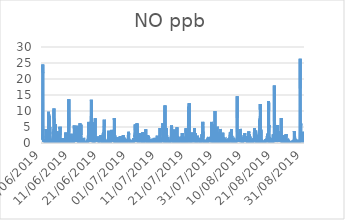
| Category | NO |
|---|---|
| 01/06/2019 | 2.2 |
| 01/06/2019 | 1.1 |
| 01/06/2019 | 1 |
| 01/06/2019 | 1.1 |
| 01/06/2019 | 2.9 |
| 01/06/2019 | 14.8 |
| 01/06/2019 | 24.5 |
| 01/06/2019 | 21.8 |
| 01/06/2019 | 12.9 |
| 01/06/2019 | 4.1 |
| 01/06/2019 | 1.1 |
| 01/06/2019 | 0.4 |
| 01/06/2019 | 0.6 |
| 01/06/2019 | 0.8 |
| 01/06/2019 | 0.4 |
| 01/06/2019 | 0.5 |
| 01/06/2019 | 0.3 |
| 01/06/2019 | 0.3 |
| 01/06/2019 | 0.6 |
| 01/06/2019 | 1 |
| 01/06/2019 | 1.1 |
| 01/06/2019 | 0.6 |
| 01/06/2019 | 0.5 |
| 01/06/2019 | 0.3 |
| 02/06/2019 | 0.2 |
| 02/06/2019 | 0.2 |
| 02/06/2019 | 0.1 |
| 02/06/2019 | 0.1 |
| 02/06/2019 | 0.1 |
| 02/06/2019 | 0.6 |
| 02/06/2019 | 1.3 |
| 02/06/2019 | 1.7 |
| 02/06/2019 | 2.1 |
| 02/06/2019 | 2.4 |
| 02/06/2019 | 4.4 |
| 02/06/2019 | 1.8 |
| 02/06/2019 | 1.4 |
| 02/06/2019 | 1.3 |
| 02/06/2019 | 0.8 |
| 02/06/2019 | 0.9 |
| 02/06/2019 | 0.6 |
| 02/06/2019 | 0.5 |
| 02/06/2019 | 0.6 |
| 02/06/2019 | 0.5 |
| 02/06/2019 | 0.6 |
| 02/06/2019 | 0.6 |
| 02/06/2019 | 0.2 |
| 02/06/2019 | 0.1 |
| 03/06/2019 | 0.3 |
| 03/06/2019 | 0.1 |
| 03/06/2019 | 0.1 |
| 03/06/2019 | 0.1 |
| 03/06/2019 | 0.2 |
| 03/06/2019 | 1.6 |
| 03/06/2019 | 3.2 |
| 03/06/2019 | 9.8 |
| 03/06/2019 | 4.8 |
| 03/06/2019 | 2.4 |
| 03/06/2019 | 2.1 |
| 03/06/2019 | 1.2 |
| 03/06/2019 | 1.9 |
| 03/06/2019 | 8.5 |
| 03/06/2019 | 1.4 |
| 03/06/2019 | 2.4 |
| 03/06/2019 | 1.5 |
| 03/06/2019 | 5 |
| 03/06/2019 | 2.7 |
| 03/06/2019 | 0.4 |
| 03/06/2019 | 0.6 |
| 03/06/2019 | 0.2 |
| 03/06/2019 | 0.2 |
| 03/06/2019 | 0.3 |
| 04/06/2019 | 0.2 |
| 04/06/2019 | 0.1 |
| 04/06/2019 | 0.1 |
| 04/06/2019 | 0.1 |
| 04/06/2019 | 0.2 |
| 04/06/2019 | 0.5 |
| 04/06/2019 | 1.3 |
| 04/06/2019 | 1.5 |
| 04/06/2019 | 1 |
| 04/06/2019 | 0.7 |
| 04/06/2019 | 1.3 |
| 04/06/2019 | 0.3 |
| 04/06/2019 | 0.4 |
| 04/06/2019 | 0.3 |
| 04/06/2019 | 0.3 |
| 04/06/2019 | 0.3 |
| 04/06/2019 | 0.2 |
| 04/06/2019 | 1.1 |
| 04/06/2019 | 0.5 |
| 04/06/2019 | 0.3 |
| 04/06/2019 | 0.1 |
| 04/06/2019 | 0.1 |
| 04/06/2019 | 0.6 |
| 04/06/2019 | 2.2 |
| 05/06/2019 | 3.8 |
| 05/06/2019 | 3.4 |
| 05/06/2019 | 4.4 |
| 05/06/2019 | 10.2 |
| 05/06/2019 | 10.8 |
| 05/06/2019 | 10.7 |
| 05/06/2019 | 6.1 |
| 05/06/2019 | 2.6 |
| 05/06/2019 | 1.8 |
| 05/06/2019 | 2 |
| 05/06/2019 | 1 |
| 05/06/2019 | 4.2 |
| 05/06/2019 | 2 |
| 05/06/2019 | 0.6 |
| 05/06/2019 | 1.7 |
| 05/06/2019 | 5.9 |
| 05/06/2019 | 0.2 |
| 05/06/2019 | 0.2 |
| 05/06/2019 | 0.2 |
| 05/06/2019 | 0.2 |
| 05/06/2019 | 0.3 |
| 05/06/2019 | 0.3 |
| 05/06/2019 | 0.1 |
| 05/06/2019 | 0.1 |
| 06/06/2019 | 0.1 |
| 06/06/2019 | 0.1 |
| 06/06/2019 | 0.1 |
| 06/06/2019 | 0.1 |
| 06/06/2019 | 0.2 |
| 06/06/2019 | 1.2 |
| 06/06/2019 | 3.7 |
| 06/06/2019 | 3.2 |
| 06/06/2019 | 2 |
| 06/06/2019 | 2.7 |
| 06/06/2019 | 1.8 |
| 06/06/2019 | 1.1 |
| 06/06/2019 | 3 |
| 06/06/2019 | 3.3 |
| 06/06/2019 | 1.8 |
| 06/06/2019 | 1.3 |
| 06/06/2019 | 0.8 |
| 06/06/2019 | 0.9 |
| 06/06/2019 | 0.5 |
| 06/06/2019 | 0.6 |
| 06/06/2019 | 0.4 |
| 06/06/2019 | 0.3 |
| 06/06/2019 | 0.1 |
| 06/06/2019 | 0.3 |
| 07/06/2019 | 0.1 |
| 07/06/2019 | 0.1 |
| 07/06/2019 | 0.1 |
| 07/06/2019 | 0.1 |
| 07/06/2019 | 0.3 |
| 07/06/2019 | 1.5 |
| 07/06/2019 | 5.1 |
| 07/06/2019 | 4.4 |
| 07/06/2019 | 5 |
| 07/06/2019 | 2.4 |
| 07/06/2019 | 1 |
| 07/06/2019 | 0.6 |
| 07/06/2019 | 0.4 |
| 07/06/2019 | 0.4 |
| 07/06/2019 | 0.3 |
| 07/06/2019 | 0.2 |
| 07/06/2019 | 0.4 |
| 07/06/2019 | 0.3 |
| 07/06/2019 | 0.2 |
| 07/06/2019 | 0.2 |
| 07/06/2019 | 0.2 |
| 07/06/2019 | 0.2 |
| 07/06/2019 | 0.1 |
| 07/06/2019 | 0.1 |
| 08/06/2019 | 0.1 |
| 08/06/2019 | 0.1 |
| 08/06/2019 | 0.1 |
| 08/06/2019 | 0.2 |
| 08/06/2019 | 0.2 |
| 08/06/2019 | 0.2 |
| 08/06/2019 | 0.4 |
| 08/06/2019 | 0.6 |
| 08/06/2019 | 0.6 |
| 08/06/2019 | 1.5 |
| 08/06/2019 | 1.2 |
| 08/06/2019 | 0.8 |
| 08/06/2019 | 1 |
| 08/06/2019 | 0.8 |
| 08/06/2019 | 0.7 |
| 08/06/2019 | 0.6 |
| 08/06/2019 | 0.5 |
| 08/06/2019 | 0.4 |
| 08/06/2019 | 0.4 |
| 08/06/2019 | 0.2 |
| 08/06/2019 | 0.2 |
| 08/06/2019 | 0.2 |
| 08/06/2019 | 0.2 |
| 08/06/2019 | 0.2 |
| 09/06/2019 | 0.2 |
| 09/06/2019 | 0.2 |
| 09/06/2019 | 0.2 |
| 09/06/2019 | 0.3 |
| 09/06/2019 | 0.8 |
| 09/06/2019 | 1.5 |
| 09/06/2019 | 3.3 |
| 09/06/2019 | 2.5 |
| 09/06/2019 | 1.4 |
| 09/06/2019 | 0.6 |
| 09/06/2019 | 1 |
| 09/06/2019 | 0.9 |
| 09/06/2019 | 0.5 |
| 09/06/2019 | 0.7 |
| 09/06/2019 | 0.3 |
| 09/06/2019 | 0.2 |
| 09/06/2019 | 0.2 |
| 09/06/2019 | 0.2 |
| 09/06/2019 | 0.2 |
| 09/06/2019 | 0.2 |
| 09/06/2019 | 0.1 |
| 09/06/2019 | 0.2 |
| 09/06/2019 | 0.2 |
| 09/06/2019 | 0.2 |
| 10/06/2019 | 0.3 |
| 10/06/2019 | 0.5 |
| 10/06/2019 | 0.6 |
| 10/06/2019 | 0.8 |
| 10/06/2019 | 1 |
| 10/06/2019 | 3.1 |
| 10/06/2019 | 9.6 |
| 10/06/2019 | 8 |
| 10/06/2019 | 5.4 |
| 10/06/2019 | 13.7 |
| 10/06/2019 | 3.3 |
| 10/06/2019 | 1 |
| 10/06/2019 | 0.5 |
| 10/06/2019 | 2.8 |
| 10/06/2019 | 0.5 |
| 10/06/2019 | 0.7 |
| 10/06/2019 | 0.5 |
| 10/06/2019 | 0.2 |
| 10/06/2019 | 0.2 |
| 10/06/2019 | 0.4 |
| 10/06/2019 | 0.3 |
| 10/06/2019 | 0.4 |
| 10/06/2019 | 0.2 |
| 10/06/2019 | 0.1 |
| 11/06/2019 | 0.2 |
| 11/06/2019 | 0.2 |
| 11/06/2019 | 0.1 |
| 11/06/2019 | 0.2 |
| 11/06/2019 | 0.3 |
| 11/06/2019 | 2.9 |
| 11/06/2019 | 1.5 |
| 11/06/2019 | 2.1 |
| 11/06/2019 | 0.8 |
| 11/06/2019 | 0.9 |
| 11/06/2019 | 0.5 |
| 11/06/2019 | 0.8 |
| 11/06/2019 | 0.4 |
| 11/06/2019 | 0.9 |
| 11/06/2019 | 0.5 |
| 11/06/2019 | 0.6 |
| 11/06/2019 | 0.5 |
| 11/06/2019 | 0.3 |
| 11/06/2019 | 0.2 |
| 11/06/2019 | 0.2 |
| 11/06/2019 | 0.2 |
| 11/06/2019 | 0.2 |
| 11/06/2019 | 0.2 |
| 11/06/2019 | 0.2 |
| 12/06/2019 | 0.3 |
| 12/06/2019 | 0.3 |
| 12/06/2019 | 0.5 |
| 12/06/2019 | 0.6 |
| 12/06/2019 | 1.1 |
| 12/06/2019 | 2.4 |
| 12/06/2019 | 4.3 |
| 12/06/2019 | 5.5 |
| 12/06/2019 | 2.6 |
| 12/06/2019 | 1.5 |
| 12/06/2019 | 0.6 |
| 12/06/2019 | 1.7 |
| 12/06/2019 | 0.3 |
| 12/06/2019 | 1.4 |
| 12/06/2019 | 0.5 |
| 12/06/2019 | 1.3 |
| 12/06/2019 | 0.3 |
| 12/06/2019 | 1.6 |
| 12/06/2019 | 0.7 |
| 12/06/2019 | 1.1 |
| 12/06/2019 | 1 |
| 12/06/2019 | 0.6 |
| 12/06/2019 | 1.1 |
| 12/06/2019 | 0.3 |
| 13/06/2019 | 0.3 |
| 13/06/2019 | 0.2 |
| 13/06/2019 | 0.1 |
| 13/06/2019 | 0.1 |
| 13/06/2019 | 0.4 |
| 13/06/2019 | 2.3 |
| 13/06/2019 | 5 |
| 13/06/2019 | 4.9 |
| 13/06/2019 | 5.4 |
| 13/06/2019 | 5.2 |
| 13/06/2019 | 2.3 |
| 13/06/2019 | 2.2 |
| 13/06/2019 | 2.3 |
| 13/06/2019 | 0.3 |
| 13/06/2019 | 0.3 |
| 13/06/2019 | 0.4 |
| 13/06/2019 | 0.3 |
| 13/06/2019 | 1.2 |
| 13/06/2019 | 0.4 |
| 13/06/2019 | 0.4 |
| 13/06/2019 | 0.3 |
| 13/06/2019 | 0.4 |
| 13/06/2019 | 0.4 |
| 13/06/2019 | 0.2 |
| 14/06/2019 | 0.1 |
| 14/06/2019 | 0.2 |
| 14/06/2019 | 0.1 |
| 14/06/2019 | 0.2 |
| 14/06/2019 | 1.1 |
| 14/06/2019 | 2.2 |
| 14/06/2019 | 6.2 |
| 14/06/2019 | 5.9 |
| 14/06/2019 | 2.5 |
| 14/06/2019 | 2.4 |
| 14/06/2019 | 1.5 |
| 14/06/2019 | 4.7 |
| 14/06/2019 | 2.5 |
| 14/06/2019 | 2.4 |
| 14/06/2019 | 5.7 |
| 14/06/2019 | 2.6 |
| 14/06/2019 | 2.4 |
| 14/06/2019 | 1.9 |
| 14/06/2019 | 1.3 |
| 14/06/2019 | 0.4 |
| 14/06/2019 | 0.2 |
| 14/06/2019 | 0.4 |
| 14/06/2019 | 0.2 |
| 14/06/2019 | 0.3 |
| 15/06/2019 | 0.1 |
| 15/06/2019 | 0.1 |
| 15/06/2019 | 0.2 |
| 15/06/2019 | 0.2 |
| 15/06/2019 | 0.2 |
| 15/06/2019 | 0.4 |
| 15/06/2019 | 0.5 |
| 15/06/2019 | 0.6 |
| 15/06/2019 | 0.9 |
| 15/06/2019 | 0.4 |
| 15/06/2019 | 0.4 |
| 15/06/2019 | 0.4 |
| 15/06/2019 | 0.7 |
| 15/06/2019 | 1.6 |
| 15/06/2019 | 1.3 |
| 15/06/2019 | 0.7 |
| 15/06/2019 | 0.9 |
| 15/06/2019 | 0.8 |
| 15/06/2019 | 0.4 |
| 15/06/2019 | 0.3 |
| 15/06/2019 | 0.3 |
| 15/06/2019 | 0.5 |
| 15/06/2019 | 0.1 |
| 15/06/2019 | 0.4 |
| 16/06/2019 | 0.1 |
| 16/06/2019 | 0.2 |
| 16/06/2019 | 0.1 |
| 16/06/2019 | 0.1 |
| 16/06/2019 | 0.3 |
| 16/06/2019 | 0.4 |
| 16/06/2019 | 0.5 |
| 16/06/2019 | 0.6 |
| 16/06/2019 | 0.5 |
| 16/06/2019 | 0.3 |
| 16/06/2019 | 0.3 |
| 16/06/2019 | 0.3 |
| 16/06/2019 | 0.4 |
| 16/06/2019 | 0.3 |
| 16/06/2019 | 0.4 |
| 16/06/2019 | 0.5 |
| 16/06/2019 | 0.6 |
| 16/06/2019 | 0.5 |
| 16/06/2019 | 0.3 |
| 16/06/2019 | 0.4 |
| 16/06/2019 | 0.4 |
| 16/06/2019 | 0.8 |
| 16/06/2019 | 0.2 |
| 16/06/2019 | 0.1 |
| 17/06/2019 | 0.1 |
| 17/06/2019 | 0.2 |
| 17/06/2019 | 0.6 |
| 17/06/2019 | 1.1 |
| 17/06/2019 | 1.2 |
| 17/06/2019 | 2.4 |
| 17/06/2019 | 5.6 |
| 17/06/2019 | 6.6 |
| 17/06/2019 | 2.6 |
| 17/06/2019 | 1 |
| 17/06/2019 | 0.6 |
| 17/06/2019 | 2.6 |
| 17/06/2019 | 0.9 |
| 17/06/2019 | 0.4 |
| 17/06/2019 | 0.7 |
| 17/06/2019 | 0.8 |
| 17/06/2019 | 2.4 |
| 17/06/2019 | 1.3 |
| 17/06/2019 | 1.3 |
| 17/06/2019 | 1.1 |
| 17/06/2019 | 0.6 |
| 17/06/2019 | 0.9 |
| 17/06/2019 | 1.1 |
| 17/06/2019 | 0.3 |
| 18/06/2019 | 0.4 |
| 18/06/2019 | 0.7 |
| 18/06/2019 | 0.4 |
| 18/06/2019 | 3 |
| 18/06/2019 | 2.1 |
| 18/06/2019 | 8.4 |
| 18/06/2019 | 13.5 |
| 18/06/2019 | 5.6 |
| 18/06/2019 | 2.5 |
| 18/06/2019 | 3.6 |
| 18/06/2019 | 2.8 |
| 18/06/2019 | 2 |
| 18/06/2019 | 1 |
| 18/06/2019 | 1.8 |
| 18/06/2019 | 2.8 |
| 18/06/2019 | 1.5 |
| 18/06/2019 | 2.6 |
| 18/06/2019 | 1.5 |
| 18/06/2019 | 1.7 |
| 18/06/2019 | 0.8 |
| 18/06/2019 | 0.4 |
| 18/06/2019 | 0.8 |
| 18/06/2019 | 0.4 |
| 18/06/2019 | 0.6 |
| 19/06/2019 | 0.1 |
| 19/06/2019 | 0.1 |
| 19/06/2019 | 1.3 |
| 19/06/2019 | 0.1 |
| 19/06/2019 | 0.4 |
| 19/06/2019 | 1.4 |
| 19/06/2019 | 4.9 |
| 19/06/2019 | 6.5 |
| 19/06/2019 | 3.5 |
| 19/06/2019 | 1.4 |
| 19/06/2019 | 1.5 |
| 19/06/2019 | 1.4 |
| 19/06/2019 | 1 |
| 19/06/2019 | 2.1 |
| 19/06/2019 | 7.7 |
| 19/06/2019 | 2.3 |
| 19/06/2019 | 1.4 |
| 19/06/2019 | 1 |
| 19/06/2019 | 0.8 |
| 19/06/2019 | 0.9 |
| 19/06/2019 | 0.8 |
| 19/06/2019 | 0.4 |
| 19/06/2019 | 0.2 |
| 19/06/2019 | 0.3 |
| 20/06/2019 | 0.3 |
| 20/06/2019 | 0.1 |
| 20/06/2019 | 0.1 |
| 20/06/2019 | 0.1 |
| 20/06/2019 | 0.3 |
| 20/06/2019 | 0.7 |
| 20/06/2019 | 2 |
| 20/06/2019 | 0.9 |
| 20/06/2019 | 0.4 |
| 20/06/2019 | 0.4 |
| 20/06/2019 | 0.4 |
| 20/06/2019 | 0.6 |
| 20/06/2019 | 0.4 |
| 20/06/2019 | 0.4 |
| 20/06/2019 | 0.7 |
| 20/06/2019 | 1.2 |
| 20/06/2019 | 0.4 |
| 20/06/2019 | 0.5 |
| 20/06/2019 | 1.1 |
| 20/06/2019 | 0.4 |
| 20/06/2019 | 0.3 |
| 20/06/2019 | 0.8 |
| 20/06/2019 | 0.3 |
| 20/06/2019 | 0.2 |
| 21/06/2019 | 0.1 |
| 21/06/2019 | 0.1 |
| 21/06/2019 | 0.1 |
| 21/06/2019 | 0.1 |
| 21/06/2019 | 0.2 |
| 21/06/2019 | 0.4 |
| 21/06/2019 | 0.9 |
| 21/06/2019 | 2.2 |
| 21/06/2019 | 2.4 |
| 21/06/2019 | 1.5 |
| 21/06/2019 | 1.7 |
| 21/06/2019 | 2 |
| 21/06/2019 | 2.4 |
| 21/06/2019 | 2.7 |
| 21/06/2019 | 2.5 |
| 21/06/2019 | 1.9 |
| 21/06/2019 | 2.5 |
| 21/06/2019 | 1.4 |
| 21/06/2019 | 0.7 |
| 21/06/2019 | 0.5 |
| 21/06/2019 | 0.9 |
| 21/06/2019 | 0.4 |
| 21/06/2019 | 0.2 |
| 21/06/2019 | 0.3 |
| 22/06/2019 | 0.2 |
| 22/06/2019 | 0.2 |
| 22/06/2019 | 0.1 |
| 22/06/2019 | 0.1 |
| 22/06/2019 | 0.1 |
| 22/06/2019 | 0.2 |
| 22/06/2019 | 0.3 |
| 22/06/2019 | 0.7 |
| 22/06/2019 | 0.4 |
| 22/06/2019 | 0.7 |
| 22/06/2019 | 3 |
| 22/06/2019 | 1.4 |
| 22/06/2019 | 1.2 |
| 22/06/2019 | 1.8 |
| 22/06/2019 | 3.4 |
| 22/06/2019 | 0.9 |
| 22/06/2019 | 4.1 |
| 22/06/2019 | 5.1 |
| 22/06/2019 | 7.3 |
| 22/06/2019 | 4.9 |
| 22/06/2019 | 0.1 |
| 22/06/2019 | 0.2 |
| 22/06/2019 | 0.1 |
| 22/06/2019 | 0.1 |
| 23/06/2019 | 0.1 |
| 23/06/2019 | 0.1 |
| 23/06/2019 | 0.1 |
| 23/06/2019 | 0.1 |
| 23/06/2019 | 0.4 |
| 23/06/2019 | 0.3 |
| 23/06/2019 | 0.5 |
| 23/06/2019 | 0.5 |
| 23/06/2019 | 0.4 |
| 23/06/2019 | 0.3 |
| 23/06/2019 | 0.5 |
| 23/06/2019 | 0.5 |
| 23/06/2019 | 0.3 |
| 23/06/2019 | 0.3 |
| 23/06/2019 | 0.5 |
| 23/06/2019 | 0.5 |
| 23/06/2019 | 0.4 |
| 23/06/2019 | 0.4 |
| 23/06/2019 | 0.7 |
| 23/06/2019 | 0.3 |
| 23/06/2019 | 0.3 |
| 23/06/2019 | 0.4 |
| 23/06/2019 | 0.1 |
| 23/06/2019 | 1 |
| 24/06/2019 | 0.3 |
| 24/06/2019 | 0.1 |
| 24/06/2019 | 0.1 |
| 24/06/2019 | 0.3 |
| 24/06/2019 | 0.3 |
| 24/06/2019 | 1.3 |
| 24/06/2019 | 3.8 |
| 24/06/2019 | 2.4 |
| 24/06/2019 | 0.8 |
| 24/06/2019 | 1.7 |
| 24/06/2019 | 1.4 |
| 24/06/2019 | 1.2 |
| 24/06/2019 | 1 |
| 24/06/2019 | 0.4 |
| 24/06/2019 | 0.5 |
| 24/06/2019 | 0.3 |
| 24/06/2019 | 0.2 |
| 24/06/2019 | 0.4 |
| 24/06/2019 | 0.6 |
| 24/06/2019 | 0.3 |
| 24/06/2019 | 0.4 |
| 24/06/2019 | 0.2 |
| 24/06/2019 | 0.2 |
| 24/06/2019 | 0.2 |
| 25/06/2019 | 0.2 |
| 25/06/2019 | 0.3 |
| 25/06/2019 | 0.3 |
| 25/06/2019 | 0.5 |
| 25/06/2019 | 0.3 |
| 25/06/2019 | 0.8 |
| 25/06/2019 | 4.1 |
| 25/06/2019 | 0.9 |
| 25/06/2019 | 0.9 |
| 25/06/2019 | 0.8 |
| 25/06/2019 | 0.8 |
| 25/06/2019 | 1 |
| 25/06/2019 | 0.5 |
| 25/06/2019 | 0.8 |
| 25/06/2019 | 1.5 |
| 25/06/2019 | 0.8 |
| 25/06/2019 | 0.4 |
| 25/06/2019 | 0.5 |
| 25/06/2019 | 0.4 |
| 25/06/2019 | 0.3 |
| 25/06/2019 | 0.1 |
| 25/06/2019 | 1.1 |
| 25/06/2019 | 2.8 |
| 25/06/2019 | 0.8 |
| 26/06/2019 | 0.9 |
| 26/06/2019 | 0.4 |
| 26/06/2019 | 0.3 |
| 26/06/2019 | 0.9 |
| 26/06/2019 | 1.2 |
| 26/06/2019 | 2.5 |
| 26/06/2019 | 7.8 |
| 26/06/2019 | 7.8 |
| 26/06/2019 | 6.9 |
| 26/06/2019 | 2.5 |
| 26/06/2019 | 0.5 |
| 26/06/2019 | 0.6 |
| 26/06/2019 | 0.5 |
| 26/06/2019 | 0.2 |
| 26/06/2019 | 0.6 |
| 26/06/2019 | 0.6 |
| 26/06/2019 | 0.9 |
| 26/06/2019 | 0.2 |
| 26/06/2019 | 0.3 |
| 26/06/2019 | 0.2 |
| 26/06/2019 | 0.5 |
| 26/06/2019 | 0.4 |
| 26/06/2019 | 0.3 |
| 26/06/2019 | 0.2 |
| 27/06/2019 | 0.2 |
| 27/06/2019 | 0.1 |
| 27/06/2019 | 0.1 |
| 27/06/2019 | 0.1 |
| 27/06/2019 | 0.1 |
| 27/06/2019 | 0.3 |
| 27/06/2019 | 0.9 |
| 27/06/2019 | 1 |
| 27/06/2019 | 1.2 |
| 27/06/2019 | 1.1 |
| 27/06/2019 | 1.3 |
| 27/06/2019 | 0.9 |
| 27/06/2019 | 1.8 |
| 27/06/2019 | 0.9 |
| 27/06/2019 | 1.6 |
| 27/06/2019 | 1.5 |
| 27/06/2019 | 1.3 |
| 27/06/2019 | 1.5 |
| 27/06/2019 | 0.8 |
| 27/06/2019 | 1.1 |
| 27/06/2019 | 0.4 |
| 27/06/2019 | 0.4 |
| 27/06/2019 | 0.1 |
| 27/06/2019 | 0.1 |
| 28/06/2019 | 0.1 |
| 28/06/2019 | 0.1 |
| 28/06/2019 | 0.1 |
| 28/06/2019 | 0.1 |
| 28/06/2019 | 0.2 |
| 28/06/2019 | 0.4 |
| 28/06/2019 | 0.7 |
| 28/06/2019 | 1 |
| 28/06/2019 | 1.5 |
| 28/06/2019 | 2.2 |
| 28/06/2019 | 0.7 |
| 28/06/2019 | 0.8 |
| 28/06/2019 | 0.8 |
| 28/06/2019 | 1 |
| 28/06/2019 | 0.9 |
| 28/06/2019 | 1.7 |
| 28/06/2019 | 1 |
| 28/06/2019 | 0.6 |
| 28/06/2019 | 0.8 |
| 28/06/2019 | 0.6 |
| 28/06/2019 | 0.4 |
| 28/06/2019 | 0.3 |
| 28/06/2019 | 0.1 |
| 28/06/2019 | 0.1 |
| 29/06/2019 | 0.2 |
| 29/06/2019 | 0.2 |
| 29/06/2019 | 0.1 |
| 29/06/2019 | 0.1 |
| 29/06/2019 | 0.1 |
| 29/06/2019 | 0.1 |
| 29/06/2019 | 1.4 |
| 29/06/2019 | 1.3 |
| 29/06/2019 | 1 |
| 29/06/2019 | 2.4 |
| 29/06/2019 | 2 |
| 29/06/2019 | 1.6 |
| 29/06/2019 | 1.2 |
| 29/06/2019 | 0.7 |
| 29/06/2019 | 1.7 |
| 29/06/2019 | 1 |
| 29/06/2019 | 0.3 |
| 29/06/2019 | 0.3 |
| 29/06/2019 | 0.3 |
| 29/06/2019 | 0.2 |
| 29/06/2019 | 0.2 |
| 29/06/2019 | 0.1 |
| 29/06/2019 | 0.2 |
| 29/06/2019 | 0.5 |
| 30/06/2019 | 0.6 |
| 30/06/2019 | 0.3 |
| 30/06/2019 | 0.3 |
| 30/06/2019 | 0.5 |
| 30/06/2019 | 0.4 |
| 30/06/2019 | 0.7 |
| 30/06/2019 | 0.8 |
| 30/06/2019 | 1 |
| 30/06/2019 | 0.8 |
| 30/06/2019 | 0.4 |
| 30/06/2019 | 0.5 |
| 30/06/2019 | 0.3 |
| 30/06/2019 | 0.3 |
| 30/06/2019 | 0.4 |
| 30/06/2019 | 0.3 |
| 30/06/2019 | 0.2 |
| 30/06/2019 | 0.4 |
| 30/06/2019 | 0.7 |
| 30/06/2019 | 0.4 |
| 30/06/2019 | 0.7 |
| 30/06/2019 | 0.3 |
| 30/06/2019 | 0.3 |
| 30/06/2019 | 0.3 |
| 30/06/2019 | 0.3 |
| 01/07/2019 | 0.4 |
| 01/07/2019 | 0.3 |
| 01/07/2019 | 0.7 |
| 01/07/2019 | 0.5 |
| 01/07/2019 | 0.4 |
| 01/07/2019 | 2.7 |
| 01/07/2019 | 3.5 |
| 01/07/2019 | 3.5 |
| 01/07/2019 | 2.5 |
| 01/07/2019 | 1.3 |
| 01/07/2019 | 0.7 |
| 01/07/2019 | 0.5 |
| 01/07/2019 | 0.5 |
| 01/07/2019 | 0.6 |
| 01/07/2019 | 0.6 |
| 01/07/2019 | 0.4 |
| 01/07/2019 | 0.4 |
| 01/07/2019 | 0.2 |
| 01/07/2019 | 0.2 |
| 01/07/2019 | 0.3 |
| 01/07/2019 | 0.3 |
| 01/07/2019 | 0.1 |
| 01/07/2019 | 0.5 |
| 01/07/2019 | 0.1 |
| 02/07/2019 | 0.1 |
| 02/07/2019 | 0.1 |
| 02/07/2019 | 0.1 |
| 02/07/2019 | 0.1 |
| 02/07/2019 | 0.2 |
| 02/07/2019 | 0.3 |
| 02/07/2019 | 0.6 |
| 02/07/2019 | 0.7 |
| 02/07/2019 | 0.5 |
| 02/07/2019 | 0.4 |
| 02/07/2019 | 0.5 |
| 02/07/2019 | 0.6 |
| 02/07/2019 | 0.3 |
| 02/07/2019 | 0.7 |
| 02/07/2019 | 0.7 |
| 02/07/2019 | 0.5 |
| 02/07/2019 | 0.4 |
| 02/07/2019 | 0.3 |
| 02/07/2019 | 0.3 |
| 02/07/2019 | 0.3 |
| 02/07/2019 | 0.1 |
| 02/07/2019 | 0.7 |
| 02/07/2019 | 0.2 |
| 02/07/2019 | 0.1 |
| 03/07/2019 | 0.1 |
| 03/07/2019 | 0.1 |
| 03/07/2019 | 0.2 |
| 03/07/2019 | 0.2 |
| 03/07/2019 | 1.5 |
| 03/07/2019 | 1.1 |
| 03/07/2019 | 1.5 |
| 03/07/2019 | 1.3 |
| 03/07/2019 | 1.7 |
| 03/07/2019 | 1.3 |
| 03/07/2019 | 0.8 |
| 03/07/2019 | 1.4 |
| 03/07/2019 | 2.6 |
| 03/07/2019 | 1.8 |
| 03/07/2019 | 5.8 |
| 03/07/2019 | 4 |
| 03/07/2019 | 1.7 |
| 03/07/2019 | 1.3 |
| 03/07/2019 | 3.1 |
| 03/07/2019 | 0.8 |
| 03/07/2019 | 0.6 |
| 03/07/2019 | 0.3 |
| 03/07/2019 | 0.1 |
| 03/07/2019 | 0.2 |
| 04/07/2019 | 0.3 |
| 04/07/2019 | 0.2 |
| 04/07/2019 | 0.2 |
| 04/07/2019 | 0.2 |
| 04/07/2019 | 0.2 |
| 04/07/2019 | 1.8 |
| 04/07/2019 | 6.2 |
| 04/07/2019 | 4.3 |
| 04/07/2019 | 2.8 |
| 04/07/2019 | 4.2 |
| 04/07/2019 | 1.6 |
| 04/07/2019 | 0.4 |
| 04/07/2019 | 0.7 |
| 04/07/2019 | 2.1 |
| 04/07/2019 | 0.7 |
| 04/07/2019 | 1.1 |
| 04/07/2019 | 1.1 |
| 04/07/2019 | 1.2 |
| 04/07/2019 | 1 |
| 04/07/2019 | 0.2 |
| 04/07/2019 | 0.4 |
| 04/07/2019 | 0.6 |
| 04/07/2019 | 0.4 |
| 04/07/2019 | 0.4 |
| 05/07/2019 | 0.4 |
| 05/07/2019 | 1 |
| 05/07/2019 | 0.3 |
| 05/07/2019 | 0.6 |
| 05/07/2019 | 2.7 |
| 05/07/2019 | 2.4 |
| 05/07/2019 | 1.4 |
| 05/07/2019 | 3.1 |
| 05/07/2019 | 1.7 |
| 05/07/2019 | 1 |
| 05/07/2019 | 1.1 |
| 05/07/2019 | 0.7 |
| 05/07/2019 | 1.1 |
| 05/07/2019 | 1.2 |
| 05/07/2019 | 1.2 |
| 05/07/2019 | 0.7 |
| 05/07/2019 | 0.6 |
| 05/07/2019 | 0.8 |
| 05/07/2019 | 0.7 |
| 05/07/2019 | 0.6 |
| 05/07/2019 | 0.3 |
| 05/07/2019 | 0.3 |
| 05/07/2019 | 0.3 |
| 05/07/2019 | 0.3 |
| 06/07/2019 | 0.3 |
| 06/07/2019 | 0.1 |
| 06/07/2019 | 0.2 |
| 06/07/2019 | 0.2 |
| 06/07/2019 | 0.2 |
| 06/07/2019 | 0.8 |
| 06/07/2019 | 3.4 |
| 06/07/2019 | 2.6 |
| 06/07/2019 | 2.4 |
| 06/07/2019 | 0.7 |
| 06/07/2019 | 1 |
| 06/07/2019 | 0.6 |
| 06/07/2019 | 0.9 |
| 06/07/2019 | 0.8 |
| 06/07/2019 | 0.7 |
| 06/07/2019 | 0.9 |
| 06/07/2019 | 0.6 |
| 06/07/2019 | 0.4 |
| 06/07/2019 | 0.4 |
| 06/07/2019 | 0.2 |
| 06/07/2019 | 0.4 |
| 06/07/2019 | 0.4 |
| 06/07/2019 | 0.3 |
| 06/07/2019 | 1.2 |
| 07/07/2019 | 3.2 |
| 07/07/2019 | 0.3 |
| 07/07/2019 | 0.5 |
| 07/07/2019 | 0.1 |
| 07/07/2019 | 0.7 |
| 07/07/2019 | 1.1 |
| 07/07/2019 | 1.4 |
| 07/07/2019 | 4.3 |
| 07/07/2019 | 0.9 |
| 07/07/2019 | 0.9 |
| 07/07/2019 | 0.6 |
| 07/07/2019 | 0.8 |
| 07/07/2019 | 0.5 |
| 07/07/2019 | 0.6 |
| 07/07/2019 | 0.7 |
| 07/07/2019 | 0.5 |
| 07/07/2019 | 0.3 |
| 07/07/2019 | 0.4 |
| 07/07/2019 | 0.3 |
| 07/07/2019 | 0.4 |
| 07/07/2019 | 0.8 |
| 07/07/2019 | 0.3 |
| 07/07/2019 | 0.3 |
| 07/07/2019 | 0.2 |
| 08/07/2019 | 2.5 |
| 08/07/2019 | 0.1 |
| 08/07/2019 | 0.1 |
| 08/07/2019 | 0.1 |
| 08/07/2019 | 0.1 |
| 08/07/2019 | 0.7 |
| 08/07/2019 | 2.1 |
| 08/07/2019 | 2.2 |
| 08/07/2019 | 1.4 |
| 08/07/2019 | 1.7 |
| 08/07/2019 | 1.1 |
| 08/07/2019 | 1.3 |
| 08/07/2019 | 0.4 |
| 08/07/2019 | 0.7 |
| 08/07/2019 | 0.5 |
| 08/07/2019 | 0.9 |
| 08/07/2019 | 0.2 |
| 08/07/2019 | 0.6 |
| 08/07/2019 | 0.2 |
| 08/07/2019 | 0.5 |
| 08/07/2019 | 0.2 |
| 08/07/2019 | 0.1 |
| 08/07/2019 | 0.1 |
| 08/07/2019 | 0.1 |
| 09/07/2019 | 0.3 |
| 09/07/2019 | 0.1 |
| 09/07/2019 | 0.1 |
| 09/07/2019 | 0.1 |
| 09/07/2019 | 0.3 |
| 09/07/2019 | 0.3 |
| 09/07/2019 | 0.7 |
| 09/07/2019 | 1.3 |
| 09/07/2019 | 1.1 |
| 09/07/2019 | 1.3 |
| 09/07/2019 | 0.2 |
| 09/07/2019 | 0.5 |
| 09/07/2019 | 0.5 |
| 09/07/2019 | 0.4 |
| 09/07/2019 | 0.4 |
| 09/07/2019 | 0.2 |
| 09/07/2019 | 0.2 |
| 09/07/2019 | 0.9 |
| 09/07/2019 | 0.2 |
| 09/07/2019 | 0.2 |
| 09/07/2019 | 0.2 |
| 09/07/2019 | 0.7 |
| 09/07/2019 | 0.2 |
| 09/07/2019 | 0.1 |
| 10/07/2019 | 0.2 |
| 10/07/2019 | 0.2 |
| 10/07/2019 | 0.3 |
| 10/07/2019 | 0.2 |
| 10/07/2019 | 0.4 |
| 10/07/2019 | 0.7 |
| 10/07/2019 | 1.6 |
| 10/07/2019 | 1.5 |
| 10/07/2019 | 0.9 |
| 10/07/2019 | 0.9 |
| 10/07/2019 | 0 |
| 10/07/2019 | 0 |
| 10/07/2019 | 0 |
| 10/07/2019 | 0 |
| 10/07/2019 | 0 |
| 10/07/2019 | 0 |
| 10/07/2019 | 0 |
| 10/07/2019 | 1.5 |
| 10/07/2019 | 1.7 |
| 10/07/2019 | 1.1 |
| 10/07/2019 | 1.4 |
| 10/07/2019 | 1.2 |
| 10/07/2019 | 0.3 |
| 10/07/2019 | 0.6 |
| 11/07/2019 | 0.3 |
| 11/07/2019 | 0.4 |
| 11/07/2019 | 0.1 |
| 11/07/2019 | 0.2 |
| 11/07/2019 | 0.6 |
| 11/07/2019 | 0.8 |
| 11/07/2019 | 1 |
| 11/07/2019 | 2.3 |
| 11/07/2019 | 0 |
| 11/07/2019 | 0 |
| 11/07/2019 | 0 |
| 11/07/2019 | 0 |
| 11/07/2019 | 0 |
| 11/07/2019 | 0.9 |
| 11/07/2019 | 1.1 |
| 11/07/2019 | 0.7 |
| 11/07/2019 | 0.6 |
| 11/07/2019 | 0.3 |
| 11/07/2019 | 0.3 |
| 11/07/2019 | 0.2 |
| 11/07/2019 | 0.1 |
| 11/07/2019 | 0.2 |
| 11/07/2019 | 0.2 |
| 11/07/2019 | 0.2 |
| 12/07/2019 | 0.3 |
| 12/07/2019 | 0.3 |
| 12/07/2019 | 0.3 |
| 12/07/2019 | 0.5 |
| 12/07/2019 | 0.5 |
| 12/07/2019 | 1.1 |
| 12/07/2019 | 4.7 |
| 12/07/2019 | 2.1 |
| 12/07/2019 | 1.9 |
| 12/07/2019 | 1.4 |
| 12/07/2019 | 0.9 |
| 12/07/2019 | 0.7 |
| 12/07/2019 | 0.7 |
| 12/07/2019 | 1 |
| 12/07/2019 | 0.6 |
| 12/07/2019 | 0.4 |
| 12/07/2019 | 0.5 |
| 12/07/2019 | 0.3 |
| 12/07/2019 | 0.8 |
| 12/07/2019 | 1.4 |
| 12/07/2019 | 0.3 |
| 12/07/2019 | 0.4 |
| 12/07/2019 | 0.5 |
| 12/07/2019 | 0.6 |
| 13/07/2019 | 1.6 |
| 13/07/2019 | 0.6 |
| 13/07/2019 | 0.3 |
| 13/07/2019 | 0.7 |
| 13/07/2019 | 0.4 |
| 13/07/2019 | 1.7 |
| 13/07/2019 | 6.2 |
| 13/07/2019 | 4.7 |
| 13/07/2019 | 5.3 |
| 13/07/2019 | 3.4 |
| 13/07/2019 | 4.1 |
| 13/07/2019 | 1 |
| 13/07/2019 | 0.5 |
| 13/07/2019 | 0.7 |
| 13/07/2019 | 0.6 |
| 13/07/2019 | 1.2 |
| 13/07/2019 | 2.7 |
| 13/07/2019 | 0.9 |
| 13/07/2019 | 1.3 |
| 13/07/2019 | 0.4 |
| 13/07/2019 | 0.5 |
| 13/07/2019 | 0.5 |
| 13/07/2019 | 1 |
| 13/07/2019 | 0.2 |
| 14/07/2019 | 11.7 |
| 14/07/2019 | 0.2 |
| 14/07/2019 | 0.2 |
| 14/07/2019 | 0.4 |
| 14/07/2019 | 0.2 |
| 14/07/2019 | 1.8 |
| 14/07/2019 | 3.1 |
| 14/07/2019 | 2.1 |
| 14/07/2019 | 2.3 |
| 14/07/2019 | 0.4 |
| 14/07/2019 | 0.5 |
| 14/07/2019 | 4.7 |
| 14/07/2019 | 0.6 |
| 14/07/2019 | 4.2 |
| 14/07/2019 | 2 |
| 14/07/2019 | 1.6 |
| 14/07/2019 | 0.6 |
| 14/07/2019 | 1.6 |
| 14/07/2019 | 0.2 |
| 14/07/2019 | 0.6 |
| 14/07/2019 | 1 |
| 14/07/2019 | 1.2 |
| 14/07/2019 | 0.9 |
| 14/07/2019 | 1.3 |
| 15/07/2019 | 1.9 |
| 15/07/2019 | 1.9 |
| 15/07/2019 | 0.2 |
| 15/07/2019 | 0.2 |
| 15/07/2019 | 0.2 |
| 15/07/2019 | 0.2 |
| 15/07/2019 | 0.6 |
| 15/07/2019 | 0.5 |
| 15/07/2019 | 0.5 |
| 15/07/2019 | 0.3 |
| 15/07/2019 | 0.3 |
| 15/07/2019 | 0.4 |
| 15/07/2019 | 0.9 |
| 15/07/2019 | 0.4 |
| 15/07/2019 | 0.3 |
| 15/07/2019 | 0.6 |
| 15/07/2019 | 0.3 |
| 15/07/2019 | 0.3 |
| 15/07/2019 | 0.4 |
| 15/07/2019 | 0.2 |
| 15/07/2019 | 0.2 |
| 15/07/2019 | 0.1 |
| 15/07/2019 | 0.2 |
| 15/07/2019 | 0.2 |
| 16/07/2019 | 0.3 |
| 16/07/2019 | 0.3 |
| 16/07/2019 | 0.7 |
| 16/07/2019 | 0.8 |
| 16/07/2019 | 0.6 |
| 16/07/2019 | 3.2 |
| 16/07/2019 | 5.1 |
| 16/07/2019 | 5.5 |
| 16/07/2019 | 4.9 |
| 16/07/2019 | 2.3 |
| 16/07/2019 | 1.8 |
| 16/07/2019 | 2.4 |
| 16/07/2019 | 2.1 |
| 16/07/2019 | 1.2 |
| 16/07/2019 | 1.3 |
| 16/07/2019 | 1.9 |
| 16/07/2019 | 1.5 |
| 16/07/2019 | 1 |
| 16/07/2019 | 2.6 |
| 16/07/2019 | 1.4 |
| 16/07/2019 | 1.2 |
| 16/07/2019 | 0.8 |
| 16/07/2019 | 0.9 |
| 16/07/2019 | 0.7 |
| 17/07/2019 | 1.1 |
| 17/07/2019 | 0.2 |
| 17/07/2019 | 2 |
| 17/07/2019 | 0.1 |
| 17/07/2019 | 1.1 |
| 17/07/2019 | 1.9 |
| 17/07/2019 | 3.2 |
| 17/07/2019 | 4.2 |
| 17/07/2019 | 2.1 |
| 17/07/2019 | 1.1 |
| 17/07/2019 | 0.9 |
| 17/07/2019 | 0.8 |
| 17/07/2019 | 0.6 |
| 17/07/2019 | 1 |
| 17/07/2019 | 0.8 |
| 17/07/2019 | 0.4 |
| 17/07/2019 | 0.5 |
| 17/07/2019 | 0.5 |
| 17/07/2019 | 0.2 |
| 17/07/2019 | 0.2 |
| 17/07/2019 | 0.4 |
| 17/07/2019 | 0.1 |
| 17/07/2019 | 1.5 |
| 17/07/2019 | 0.3 |
| 18/07/2019 | 0.9 |
| 18/07/2019 | 0.1 |
| 18/07/2019 | 0.2 |
| 18/07/2019 | 0.4 |
| 18/07/2019 | 2.5 |
| 18/07/2019 | 4.9 |
| 18/07/2019 | 1.3 |
| 18/07/2019 | 0.7 |
| 18/07/2019 | 0.8 |
| 18/07/2019 | 1 |
| 18/07/2019 | 0.8 |
| 18/07/2019 | 2.1 |
| 18/07/2019 | 0.8 |
| 18/07/2019 | 0.6 |
| 18/07/2019 | 0.5 |
| 18/07/2019 | 0.5 |
| 18/07/2019 | 0.8 |
| 18/07/2019 | 1.5 |
| 18/07/2019 | 0.6 |
| 18/07/2019 | 0.3 |
| 18/07/2019 | 0.4 |
| 18/07/2019 | 0.3 |
| 18/07/2019 | 0.3 |
| 18/07/2019 | 0.2 |
| 19/07/2019 | 0.1 |
| 19/07/2019 | 0.2 |
| 19/07/2019 | 0.2 |
| 19/07/2019 | 0.2 |
| 19/07/2019 | 0.2 |
| 19/07/2019 | 0.5 |
| 19/07/2019 | 1.8 |
| 19/07/2019 | 0.4 |
| 19/07/2019 | 0.4 |
| 19/07/2019 | 1 |
| 19/07/2019 | 0.7 |
| 19/07/2019 | 0.6 |
| 19/07/2019 | 0.6 |
| 19/07/2019 | 0.5 |
| 19/07/2019 | 0.7 |
| 19/07/2019 | 0.6 |
| 19/07/2019 | 1.5 |
| 19/07/2019 | 0.4 |
| 19/07/2019 | 0.3 |
| 19/07/2019 | 0.2 |
| 19/07/2019 | 0.2 |
| 19/07/2019 | 0.7 |
| 19/07/2019 | 2 |
| 19/07/2019 | 0.1 |
| 20/07/2019 | 0.5 |
| 20/07/2019 | 3.1 |
| 20/07/2019 | 0.2 |
| 20/07/2019 | 0.2 |
| 20/07/2019 | 0.2 |
| 20/07/2019 | 2 |
| 20/07/2019 | 1.4 |
| 20/07/2019 | 0.9 |
| 20/07/2019 | 0.4 |
| 20/07/2019 | 0.3 |
| 20/07/2019 | 0.5 |
| 20/07/2019 | 0.5 |
| 20/07/2019 | 0.6 |
| 20/07/2019 | 0.3 |
| 20/07/2019 | 0.3 |
| 20/07/2019 | 0.3 |
| 20/07/2019 | 0.4 |
| 20/07/2019 | 0.3 |
| 20/07/2019 | 0.9 |
| 20/07/2019 | 0.2 |
| 20/07/2019 | 0.4 |
| 20/07/2019 | 0.5 |
| 20/07/2019 | 0.1 |
| 20/07/2019 | 0.3 |
| 21/07/2019 | 0.2 |
| 21/07/2019 | 0.2 |
| 21/07/2019 | 0.3 |
| 21/07/2019 | 0.2 |
| 21/07/2019 | 0.3 |
| 21/07/2019 | 1.8 |
| 21/07/2019 | 2.5 |
| 21/07/2019 | 2.7 |
| 21/07/2019 | 4.6 |
| 21/07/2019 | 3.6 |
| 21/07/2019 | 2.3 |
| 21/07/2019 | 1.1 |
| 21/07/2019 | 0.7 |
| 21/07/2019 | 1.5 |
| 21/07/2019 | 0.2 |
| 21/07/2019 | 0.3 |
| 21/07/2019 | 0.4 |
| 21/07/2019 | 0.2 |
| 21/07/2019 | 0.7 |
| 21/07/2019 | 0.2 |
| 21/07/2019 | 0.2 |
| 21/07/2019 | 0.2 |
| 21/07/2019 | 0.6 |
| 21/07/2019 | 0.5 |
| 22/07/2019 | 0.4 |
| 22/07/2019 | 0.3 |
| 22/07/2019 | 2.4 |
| 22/07/2019 | 0.4 |
| 22/07/2019 | 0.5 |
| 22/07/2019 | 4.1 |
| 22/07/2019 | 11.3 |
| 22/07/2019 | 6.4 |
| 22/07/2019 | 3.5 |
| 22/07/2019 | 2.6 |
| 22/07/2019 | 0.9 |
| 22/07/2019 | 12.4 |
| 22/07/2019 | 3.9 |
| 22/07/2019 | 3.4 |
| 22/07/2019 | 2.3 |
| 22/07/2019 | 0.7 |
| 22/07/2019 | 0.6 |
| 22/07/2019 | 0.6 |
| 22/07/2019 | 0.9 |
| 22/07/2019 | 0.4 |
| 22/07/2019 | 0.8 |
| 22/07/2019 | 1 |
| 22/07/2019 | 0.4 |
| 22/07/2019 | 0.2 |
| 23/07/2019 | 0.4 |
| 23/07/2019 | 0.1 |
| 23/07/2019 | 0.1 |
| 23/07/2019 | 0.2 |
| 23/07/2019 | 0.3 |
| 23/07/2019 | 1.1 |
| 23/07/2019 | 2.4 |
| 23/07/2019 | 3.3 |
| 23/07/2019 | 3.5 |
| 23/07/2019 | 1.5 |
| 23/07/2019 | 1 |
| 23/07/2019 | 1.8 |
| 23/07/2019 | 0.7 |
| 23/07/2019 | 1.4 |
| 23/07/2019 | 0.9 |
| 23/07/2019 | 2.2 |
| 23/07/2019 | 1.9 |
| 23/07/2019 | 1.6 |
| 23/07/2019 | 1 |
| 23/07/2019 | 0.9 |
| 23/07/2019 | 0.7 |
| 23/07/2019 | 1.5 |
| 23/07/2019 | 0.6 |
| 23/07/2019 | 0.8 |
| 24/07/2019 | 0.2 |
| 24/07/2019 | 0.2 |
| 24/07/2019 | 0.1 |
| 24/07/2019 | 0.2 |
| 24/07/2019 | 0.2 |
| 24/07/2019 | 1.7 |
| 24/07/2019 | 3.1 |
| 24/07/2019 | 2.5 |
| 24/07/2019 | 4.6 |
| 24/07/2019 | 2.1 |
| 24/07/2019 | 0.8 |
| 24/07/2019 | 1.8 |
| 24/07/2019 | 1.3 |
| 24/07/2019 | 1.5 |
| 24/07/2019 | 3.1 |
| 24/07/2019 | 1.9 |
| 24/07/2019 | 2 |
| 24/07/2019 | 2.4 |
| 24/07/2019 | 1 |
| 24/07/2019 | 0.8 |
| 24/07/2019 | 0.6 |
| 24/07/2019 | 0.5 |
| 24/07/2019 | 0.4 |
| 24/07/2019 | 0.1 |
| 25/07/2019 | 0.4 |
| 25/07/2019 | 0.3 |
| 25/07/2019 | 0.2 |
| 25/07/2019 | 0.2 |
| 25/07/2019 | 0.5 |
| 25/07/2019 | 0.3 |
| 25/07/2019 | 2.3 |
| 25/07/2019 | 0.6 |
| 25/07/2019 | 0.5 |
| 25/07/2019 | 0.7 |
| 25/07/2019 | 1.3 |
| 25/07/2019 | 1.6 |
| 25/07/2019 | 1 |
| 25/07/2019 | 0.9 |
| 25/07/2019 | 0.6 |
| 25/07/2019 | 0.5 |
| 25/07/2019 | 0.6 |
| 25/07/2019 | 0.5 |
| 25/07/2019 | 1.6 |
| 25/07/2019 | 0.6 |
| 25/07/2019 | 0.3 |
| 25/07/2019 | 1 |
| 25/07/2019 | 0.2 |
| 25/07/2019 | 0.2 |
| 26/07/2019 | 0.1 |
| 26/07/2019 | 0.4 |
| 26/07/2019 | 0.1 |
| 26/07/2019 | 0.1 |
| 26/07/2019 | 0.2 |
| 26/07/2019 | 0.2 |
| 26/07/2019 | 1.4 |
| 26/07/2019 | 0.3 |
| 26/07/2019 | 0.4 |
| 26/07/2019 | 0.3 |
| 26/07/2019 | 0.3 |
| 26/07/2019 | 0.3 |
| 26/07/2019 | 0.3 |
| 26/07/2019 | 0.4 |
| 26/07/2019 | 0.3 |
| 26/07/2019 | 0.3 |
| 26/07/2019 | 0.5 |
| 26/07/2019 | 0.3 |
| 26/07/2019 | 0.4 |
| 26/07/2019 | 0.5 |
| 26/07/2019 | 1.3 |
| 26/07/2019 | 1.2 |
| 26/07/2019 | 0.7 |
| 26/07/2019 | 2.7 |
| 27/07/2019 | 0.2 |
| 27/07/2019 | 0.3 |
| 27/07/2019 | 1 |
| 27/07/2019 | 0.5 |
| 27/07/2019 | 0.5 |
| 27/07/2019 | 6.6 |
| 27/07/2019 | 5.6 |
| 27/07/2019 | 3.2 |
| 27/07/2019 | 3.6 |
| 27/07/2019 | 1.6 |
| 27/07/2019 | 0.8 |
| 27/07/2019 | 0.9 |
| 27/07/2019 | 0.6 |
| 27/07/2019 | 0.6 |
| 27/07/2019 | 0.6 |
| 27/07/2019 | 0.7 |
| 27/07/2019 | 0.9 |
| 27/07/2019 | 0.8 |
| 27/07/2019 | 0.3 |
| 27/07/2019 | 1 |
| 27/07/2019 | 0.3 |
| 27/07/2019 | 0.3 |
| 27/07/2019 | 0.3 |
| 27/07/2019 | 0.3 |
| 28/07/2019 | 0.2 |
| 28/07/2019 | 0.1 |
| 28/07/2019 | 0.1 |
| 28/07/2019 | 0.1 |
| 28/07/2019 | 0.1 |
| 28/07/2019 | 0.1 |
| 28/07/2019 | 0.2 |
| 28/07/2019 | 0.2 |
| 28/07/2019 | 0.2 |
| 28/07/2019 | 0.2 |
| 28/07/2019 | 0.2 |
| 28/07/2019 | 0.2 |
| 28/07/2019 | 0.6 |
| 28/07/2019 | 0.2 |
| 28/07/2019 | 0.1 |
| 28/07/2019 | 0.2 |
| 28/07/2019 | 0.2 |
| 28/07/2019 | 0.2 |
| 28/07/2019 | 0.4 |
| 28/07/2019 | 0.2 |
| 28/07/2019 | 0.2 |
| 28/07/2019 | 0.3 |
| 28/07/2019 | 0.1 |
| 28/07/2019 | 0.1 |
| 29/07/2019 | 0.1 |
| 29/07/2019 | 0.1 |
| 29/07/2019 | 0.1 |
| 29/07/2019 | 0.2 |
| 29/07/2019 | 0.2 |
| 29/07/2019 | 0.4 |
| 29/07/2019 | 1.1 |
| 29/07/2019 | 1.8 |
| 29/07/2019 | 1.3 |
| 29/07/2019 | 0.6 |
| 29/07/2019 | 0.5 |
| 29/07/2019 | 1.1 |
| 29/07/2019 | 1 |
| 29/07/2019 | 0.7 |
| 29/07/2019 | 0.7 |
| 29/07/2019 | 0.9 |
| 29/07/2019 | 0.4 |
| 29/07/2019 | 1.4 |
| 29/07/2019 | 0.7 |
| 29/07/2019 | 0.8 |
| 29/07/2019 | 0.8 |
| 29/07/2019 | 1.9 |
| 29/07/2019 | 0.7 |
| 29/07/2019 | 0.4 |
| 30/07/2019 | 0.2 |
| 30/07/2019 | 0.1 |
| 30/07/2019 | 0.1 |
| 30/07/2019 | 0.2 |
| 30/07/2019 | 0.3 |
| 30/07/2019 | 0.7 |
| 30/07/2019 | 2.5 |
| 30/07/2019 | 6.6 |
| 30/07/2019 | 3.3 |
| 30/07/2019 | 2 |
| 30/07/2019 | 1.4 |
| 30/07/2019 | 2.3 |
| 30/07/2019 | 1.8 |
| 30/07/2019 | 2.7 |
| 30/07/2019 | 1.3 |
| 30/07/2019 | 1.1 |
| 30/07/2019 | 1.6 |
| 30/07/2019 | 1.5 |
| 30/07/2019 | 1.3 |
| 30/07/2019 | 1.1 |
| 30/07/2019 | 0.5 |
| 30/07/2019 | 0.2 |
| 30/07/2019 | 0.2 |
| 30/07/2019 | 0.1 |
| 31/07/2019 | 0.2 |
| 31/07/2019 | 0.1 |
| 31/07/2019 | 0.3 |
| 31/07/2019 | 0.1 |
| 31/07/2019 | 0.5 |
| 31/07/2019 | 1.9 |
| 31/07/2019 | 5.8 |
| 31/07/2019 | 4.6 |
| 31/07/2019 | 2.2 |
| 31/07/2019 | 4.7 |
| 31/07/2019 | 1 |
| 31/07/2019 | 3.5 |
| 31/07/2019 | 10 |
| 31/07/2019 | 1.6 |
| 31/07/2019 | 0.4 |
| 31/07/2019 | 0.3 |
| 31/07/2019 | 1.4 |
| 31/07/2019 | 0.4 |
| 31/07/2019 | 0.2 |
| 31/07/2019 | 0.2 |
| 31/07/2019 | 0.1 |
| 31/07/2019 | 0.3 |
| 31/07/2019 | 0.3 |
| 31/07/2019 | 0.3 |
| 01/08/2019 | 0.2 |
| 01/08/2019 | 0.2 |
| 01/08/2019 | 0.2 |
| 01/08/2019 | 0.1 |
| 01/08/2019 | 0.4 |
| 01/08/2019 | 1.2 |
| 01/08/2019 | 5.1 |
| 01/08/2019 | 4.7 |
| 01/08/2019 | 2.9 |
| 01/08/2019 | 3.4 |
| 01/08/2019 | 2.6 |
| 01/08/2019 | 2.9 |
| 01/08/2019 | 1.9 |
| 01/08/2019 | 3.3 |
| 01/08/2019 | 1.6 |
| 01/08/2019 | 2.1 |
| 01/08/2019 | 1.7 |
| 01/08/2019 | 1.4 |
| 01/08/2019 | 1.2 |
| 01/08/2019 | 1.7 |
| 01/08/2019 | 0.9 |
| 01/08/2019 | 0.5 |
| 01/08/2019 | 0.2 |
| 01/08/2019 | 0.4 |
| 02/08/2019 | 0.2 |
| 02/08/2019 | 0.1 |
| 02/08/2019 | 0.1 |
| 02/08/2019 | 1.1 |
| 02/08/2019 | 0.3 |
| 02/08/2019 | 0.6 |
| 02/08/2019 | 3.3 |
| 02/08/2019 | 3.3 |
| 02/08/2019 | 4.4 |
| 02/08/2019 | 3.3 |
| 02/08/2019 | 1.9 |
| 02/08/2019 | 2.8 |
| 02/08/2019 | 0.9 |
| 02/08/2019 | 1.8 |
| 02/08/2019 | 0.7 |
| 02/08/2019 | 1.5 |
| 02/08/2019 | 1.5 |
| 02/08/2019 | 1.7 |
| 02/08/2019 | 2 |
| 02/08/2019 | 1 |
| 02/08/2019 | 1 |
| 02/08/2019 | 0.2 |
| 02/08/2019 | 0.6 |
| 02/08/2019 | 0.2 |
| 03/08/2019 | 0.6 |
| 03/08/2019 | 0.5 |
| 03/08/2019 | 0.4 |
| 03/08/2019 | 0.1 |
| 03/08/2019 | 0.3 |
| 03/08/2019 | 3.2 |
| 03/08/2019 | 2.1 |
| 03/08/2019 | 1.8 |
| 03/08/2019 | 1 |
| 03/08/2019 | 0.8 |
| 03/08/2019 | 1.3 |
| 03/08/2019 | 1 |
| 03/08/2019 | 0.7 |
| 03/08/2019 | 1 |
| 03/08/2019 | 1.8 |
| 03/08/2019 | 0.6 |
| 03/08/2019 | 0.6 |
| 03/08/2019 | 0.6 |
| 03/08/2019 | 0.5 |
| 03/08/2019 | 0.2 |
| 03/08/2019 | 0.2 |
| 03/08/2019 | 0.2 |
| 03/08/2019 | 0.1 |
| 03/08/2019 | 0.1 |
| 04/08/2019 | 0.1 |
| 04/08/2019 | 0.1 |
| 04/08/2019 | 0.1 |
| 04/08/2019 | 0.1 |
| 04/08/2019 | 0.7 |
| 04/08/2019 | 0.3 |
| 04/08/2019 | 0.9 |
| 04/08/2019 | 0.8 |
| 04/08/2019 | 0.6 |
| 04/08/2019 | 0.4 |
| 04/08/2019 | 0.2 |
| 04/08/2019 | 0.8 |
| 04/08/2019 | 0.5 |
| 04/08/2019 | 0.3 |
| 04/08/2019 | 0.2 |
| 04/08/2019 | 0.1 |
| 04/08/2019 | 0.2 |
| 04/08/2019 | 0.4 |
| 04/08/2019 | 0.7 |
| 04/08/2019 | 1.1 |
| 04/08/2019 | 0.2 |
| 04/08/2019 | 0.7 |
| 04/08/2019 | 0.4 |
| 04/08/2019 | 0.4 |
| 05/08/2019 | 0.2 |
| 05/08/2019 | 0.7 |
| 05/08/2019 | 0.2 |
| 05/08/2019 | 0.2 |
| 05/08/2019 | 0.2 |
| 05/08/2019 | 1 |
| 05/08/2019 | 1.2 |
| 05/08/2019 | 1.1 |
| 05/08/2019 | 0.5 |
| 05/08/2019 | 1.5 |
| 05/08/2019 | 0.6 |
| 05/08/2019 | 0.7 |
| 05/08/2019 | 0.2 |
| 05/08/2019 | 0.3 |
| 05/08/2019 | 0.2 |
| 05/08/2019 | 0.3 |
| 05/08/2019 | 0.1 |
| 05/08/2019 | 0.2 |
| 05/08/2019 | 0.3 |
| 05/08/2019 | 0.2 |
| 05/08/2019 | 0.5 |
| 05/08/2019 | 3.3 |
| 05/08/2019 | 2.5 |
| 05/08/2019 | 3.2 |
| 06/08/2019 | 0.2 |
| 06/08/2019 | 0.3 |
| 06/08/2019 | 0.3 |
| 06/08/2019 | 2 |
| 06/08/2019 | 0.3 |
| 06/08/2019 | 3.3 |
| 06/08/2019 | 4.4 |
| 06/08/2019 | 2.5 |
| 06/08/2019 | 1.7 |
| 06/08/2019 | 1.3 |
| 06/08/2019 | 0.4 |
| 06/08/2019 | 0.3 |
| 06/08/2019 | 1.4 |
| 06/08/2019 | 0.8 |
| 06/08/2019 | 0.2 |
| 06/08/2019 | 0.4 |
| 06/08/2019 | 0.4 |
| 06/08/2019 | 0.4 |
| 06/08/2019 | 0.6 |
| 06/08/2019 | 0.2 |
| 06/08/2019 | 0.2 |
| 06/08/2019 | 0.3 |
| 06/08/2019 | 0.2 |
| 06/08/2019 | 0.2 |
| 07/08/2019 | 0.1 |
| 07/08/2019 | 0.1 |
| 07/08/2019 | 0.1 |
| 07/08/2019 | 0.3 |
| 07/08/2019 | 0.2 |
| 07/08/2019 | 0.4 |
| 07/08/2019 | 0.8 |
| 07/08/2019 | 0.8 |
| 07/08/2019 | 1 |
| 07/08/2019 | 0.9 |
| 07/08/2019 | 0.5 |
| 07/08/2019 | 0.4 |
| 07/08/2019 | 0.7 |
| 07/08/2019 | 0.4 |
| 07/08/2019 | 0.5 |
| 07/08/2019 | 0.3 |
| 07/08/2019 | 0.5 |
| 07/08/2019 | 0.4 |
| 07/08/2019 | 0.2 |
| 07/08/2019 | 0.2 |
| 07/08/2019 | 0.3 |
| 07/08/2019 | 0.1 |
| 07/08/2019 | 0.6 |
| 07/08/2019 | 0.5 |
| 08/08/2019 | 0.3 |
| 08/08/2019 | 0.8 |
| 08/08/2019 | 0.4 |
| 08/08/2019 | 0.3 |
| 08/08/2019 | 0.5 |
| 08/08/2019 | 1.6 |
| 08/08/2019 | 14.6 |
| 08/08/2019 | 7.8 |
| 08/08/2019 | 2.1 |
| 08/08/2019 | 1.3 |
| 08/08/2019 | 0.3 |
| 08/08/2019 | 1.1 |
| 08/08/2019 | 0.7 |
| 08/08/2019 | 0.6 |
| 08/08/2019 | 0.7 |
| 08/08/2019 | 0.3 |
| 08/08/2019 | 0.3 |
| 08/08/2019 | 0.4 |
| 08/08/2019 | 0.3 |
| 08/08/2019 | 1.4 |
| 08/08/2019 | 0.6 |
| 08/08/2019 | 1.7 |
| 08/08/2019 | 0.4 |
| 08/08/2019 | 0.1 |
| 09/08/2019 | 0.2 |
| 09/08/2019 | 0.6 |
| 09/08/2019 | 0.1 |
| 09/08/2019 | 0.1 |
| 09/08/2019 | 0.3 |
| 09/08/2019 | 0.7 |
| 09/08/2019 | 3.3 |
| 09/08/2019 | 4.4 |
| 09/08/2019 | 4.6 |
| 09/08/2019 | 3.6 |
| 09/08/2019 | 2.4 |
| 09/08/2019 | 0.9 |
| 09/08/2019 | 1 |
| 09/08/2019 | 2 |
| 09/08/2019 | 2.4 |
| 09/08/2019 | 1.1 |
| 09/08/2019 | 1.5 |
| 09/08/2019 | 0.9 |
| 09/08/2019 | 1.8 |
| 09/08/2019 | 0.4 |
| 09/08/2019 | 0.9 |
| 09/08/2019 | 0.7 |
| 09/08/2019 | 0.6 |
| 09/08/2019 | 0.2 |
| 10/08/2019 | 0.6 |
| 10/08/2019 | 0.2 |
| 10/08/2019 | 0.2 |
| 10/08/2019 | 0.3 |
| 10/08/2019 | 0.1 |
| 10/08/2019 | 0.1 |
| 10/08/2019 | 0.4 |
| 10/08/2019 | 1.3 |
| 10/08/2019 | 0.5 |
| 10/08/2019 | 0.5 |
| 10/08/2019 | 0.3 |
| 10/08/2019 | 0.6 |
| 10/08/2019 | 0.6 |
| 10/08/2019 | 0.3 |
| 10/08/2019 | 0.9 |
| 10/08/2019 | 0.5 |
| 10/08/2019 | 1.4 |
| 10/08/2019 | 1.2 |
| 10/08/2019 | 0.3 |
| 10/08/2019 | 0.7 |
| 10/08/2019 | 1.1 |
| 10/08/2019 | 3.1 |
| 10/08/2019 | 3.4 |
| 10/08/2019 | 1.3 |
| 11/08/2019 | 2 |
| 11/08/2019 | 1.4 |
| 11/08/2019 | 1.6 |
| 11/08/2019 | 0.4 |
| 11/08/2019 | 0.3 |
| 11/08/2019 | 0.5 |
| 11/08/2019 | 1.2 |
| 11/08/2019 | 2.1 |
| 11/08/2019 | 1.5 |
| 11/08/2019 | 0.7 |
| 11/08/2019 | 0.6 |
| 11/08/2019 | 1.5 |
| 11/08/2019 | 1.4 |
| 11/08/2019 | 1.6 |
| 11/08/2019 | 1.4 |
| 11/08/2019 | 1.2 |
| 11/08/2019 | 1.2 |
| 11/08/2019 | 1.2 |
| 11/08/2019 | 0.7 |
| 11/08/2019 | 0.4 |
| 11/08/2019 | 0.7 |
| 11/08/2019 | 0.4 |
| 11/08/2019 | 0.1 |
| 11/08/2019 | 0.5 |
| 12/08/2019 | 0.2 |
| 12/08/2019 | 0.1 |
| 12/08/2019 | 0.3 |
| 12/08/2019 | 0.3 |
| 12/08/2019 | 0.2 |
| 12/08/2019 | 0.4 |
| 12/08/2019 | 0 |
| 12/08/2019 | 3.6 |
| 12/08/2019 | 2.9 |
| 12/08/2019 | 2.5 |
| 12/08/2019 | 2.8 |
| 12/08/2019 | 2 |
| 12/08/2019 | 1.5 |
| 12/08/2019 | 2.1 |
| 12/08/2019 | 2.7 |
| 12/08/2019 | 1.4 |
| 12/08/2019 | 1.4 |
| 12/08/2019 | 2 |
| 12/08/2019 | 0.9 |
| 12/08/2019 | 0.6 |
| 12/08/2019 | 0.3 |
| 12/08/2019 | 0.1 |
| 12/08/2019 | 0.3 |
| 12/08/2019 | 0.2 |
| 13/08/2019 | 0.2 |
| 13/08/2019 | 0.1 |
| 13/08/2019 | 0.2 |
| 13/08/2019 | 0.1 |
| 13/08/2019 | 0.4 |
| 13/08/2019 | 0.5 |
| 13/08/2019 | 0.4 |
| 13/08/2019 | 1.2 |
| 13/08/2019 | 0.7 |
| 13/08/2019 | 0.6 |
| 13/08/2019 | 0.7 |
| 13/08/2019 | 0.5 |
| 13/08/2019 | 0.6 |
| 13/08/2019 | 0.6 |
| 13/08/2019 | 0.2 |
| 13/08/2019 | 0.3 |
| 13/08/2019 | 0.4 |
| 13/08/2019 | 0.3 |
| 13/08/2019 | 0.7 |
| 13/08/2019 | 0.2 |
| 13/08/2019 | 1.4 |
| 13/08/2019 | 1.1 |
| 13/08/2019 | 1.4 |
| 13/08/2019 | 0.6 |
| 14/08/2019 | 0.3 |
| 14/08/2019 | 0.3 |
| 14/08/2019 | 0.3 |
| 14/08/2019 | 0.3 |
| 14/08/2019 | 0.7 |
| 14/08/2019 | 1.2 |
| 14/08/2019 | 1.9 |
| 14/08/2019 | 4.7 |
| 14/08/2019 | 3.5 |
| 14/08/2019 | 1.3 |
| 14/08/2019 | 1.9 |
| 14/08/2019 | 0.8 |
| 14/08/2019 | 0.6 |
| 14/08/2019 | 2.4 |
| 14/08/2019 | 2.6 |
| 14/08/2019 | 1.4 |
| 14/08/2019 | 2.8 |
| 14/08/2019 | 3.9 |
| 14/08/2019 | 2.1 |
| 14/08/2019 | 1.7 |
| 14/08/2019 | 0.6 |
| 14/08/2019 | 0.9 |
| 14/08/2019 | 0.7 |
| 14/08/2019 | 0.4 |
| 15/08/2019 | 0.4 |
| 15/08/2019 | 0.2 |
| 15/08/2019 | 0.2 |
| 15/08/2019 | 0.3 |
| 15/08/2019 | 0.5 |
| 15/08/2019 | 0.8 |
| 15/08/2019 | 1.7 |
| 15/08/2019 | 2.6 |
| 15/08/2019 | 2.5 |
| 15/08/2019 | 1.1 |
| 15/08/2019 | 1.2 |
| 15/08/2019 | 1.4 |
| 15/08/2019 | 0.6 |
| 15/08/2019 | 0.4 |
| 15/08/2019 | 0.4 |
| 15/08/2019 | 0.8 |
| 15/08/2019 | 0.5 |
| 15/08/2019 | 0.2 |
| 15/08/2019 | 0.3 |
| 15/08/2019 | 0.3 |
| 15/08/2019 | 0.9 |
| 15/08/2019 | 0.2 |
| 15/08/2019 | 0.4 |
| 15/08/2019 | 0.2 |
| 16/08/2019 | 0.1 |
| 16/08/2019 | 0.2 |
| 16/08/2019 | 0.2 |
| 16/08/2019 | 0.2 |
| 16/08/2019 | 0.3 |
| 16/08/2019 | 7.3 |
| 16/08/2019 | 5.5 |
| 16/08/2019 | 8.4 |
| 16/08/2019 | 12.2 |
| 16/08/2019 | 10.2 |
| 16/08/2019 | 11.6 |
| 16/08/2019 | 3.3 |
| 16/08/2019 | 1.2 |
| 16/08/2019 | 4.2 |
| 16/08/2019 | 0.8 |
| 16/08/2019 | 0.7 |
| 16/08/2019 | 0.3 |
| 16/08/2019 | 0.4 |
| 16/08/2019 | 0.4 |
| 16/08/2019 | 0.2 |
| 16/08/2019 | 0.4 |
| 16/08/2019 | 0.1 |
| 16/08/2019 | 0.1 |
| 16/08/2019 | 0.2 |
| 17/08/2019 | 0.1 |
| 17/08/2019 | 0.1 |
| 17/08/2019 | 0.1 |
| 17/08/2019 | 0.2 |
| 17/08/2019 | 0.2 |
| 17/08/2019 | 0.2 |
| 17/08/2019 | 0.3 |
| 17/08/2019 | 0.5 |
| 17/08/2019 | 0.4 |
| 17/08/2019 | 0.3 |
| 17/08/2019 | 0.3 |
| 17/08/2019 | 0.4 |
| 17/08/2019 | 0.4 |
| 17/08/2019 | 0.3 |
| 17/08/2019 | 0.5 |
| 17/08/2019 | 0.3 |
| 17/08/2019 | 0.2 |
| 17/08/2019 | 0.3 |
| 17/08/2019 | 0.2 |
| 17/08/2019 | 0.2 |
| 17/08/2019 | 0.1 |
| 17/08/2019 | 0.1 |
| 17/08/2019 | 0.1 |
| 17/08/2019 | 0.1 |
| 18/08/2019 | 0.2 |
| 18/08/2019 | 0.2 |
| 18/08/2019 | 0.1 |
| 18/08/2019 | 0.3 |
| 18/08/2019 | 0.2 |
| 18/08/2019 | 1.1 |
| 18/08/2019 | 0.6 |
| 18/08/2019 | 1.1 |
| 18/08/2019 | 0.7 |
| 18/08/2019 | 0.7 |
| 18/08/2019 | 0.5 |
| 18/08/2019 | 0.5 |
| 18/08/2019 | 1.3 |
| 18/08/2019 | 0.4 |
| 18/08/2019 | 0.4 |
| 18/08/2019 | 1.1 |
| 18/08/2019 | 0.4 |
| 18/08/2019 | 1.1 |
| 18/08/2019 | 0.6 |
| 18/08/2019 | 0.5 |
| 18/08/2019 | 2.5 |
| 18/08/2019 | 2.9 |
| 18/08/2019 | 0.2 |
| 18/08/2019 | 0.2 |
| 19/08/2019 | 0.1 |
| 19/08/2019 | 0.7 |
| 19/08/2019 | 0.4 |
| 19/08/2019 | 0.9 |
| 19/08/2019 | 0.4 |
| 19/08/2019 | 1.3 |
| 19/08/2019 | 13.1 |
| 19/08/2019 | 10.1 |
| 19/08/2019 | 4.9 |
| 19/08/2019 | 5.6 |
| 19/08/2019 | 3.2 |
| 19/08/2019 | 3.5 |
| 19/08/2019 | 2.1 |
| 19/08/2019 | 2.1 |
| 19/08/2019 | 2.4 |
| 19/08/2019 | 1 |
| 19/08/2019 | 0.5 |
| 19/08/2019 | 0.3 |
| 19/08/2019 | 0.2 |
| 19/08/2019 | 0.1 |
| 19/08/2019 | 0.1 |
| 19/08/2019 | 0.1 |
| 19/08/2019 | 0.4 |
| 19/08/2019 | 0.1 |
| 20/08/2019 | 0.3 |
| 20/08/2019 | 0.1 |
| 20/08/2019 | 0.1 |
| 20/08/2019 | 0.1 |
| 20/08/2019 | 0.3 |
| 20/08/2019 | 0.3 |
| 20/08/2019 | 1.5 |
| 20/08/2019 | 1.6 |
| 20/08/2019 | 1.6 |
| 20/08/2019 | 0.9 |
| 20/08/2019 | 0.5 |
| 20/08/2019 | 0.3 |
| 20/08/2019 | 0.3 |
| 20/08/2019 | 0.7 |
| 20/08/2019 | 0.3 |
| 20/08/2019 | 0.5 |
| 20/08/2019 | 0.5 |
| 20/08/2019 | 0.4 |
| 20/08/2019 | 0.4 |
| 20/08/2019 | 0.3 |
| 20/08/2019 | 1.9 |
| 20/08/2019 | 2.7 |
| 20/08/2019 | 0.5 |
| 20/08/2019 | 0.4 |
| 21/08/2019 | 0.8 |
| 21/08/2019 | 0.3 |
| 21/08/2019 | 0.3 |
| 21/08/2019 | 0.5 |
| 21/08/2019 | 0.8 |
| 21/08/2019 | 1.8 |
| 21/08/2019 | 18 |
| 21/08/2019 | 6.9 |
| 21/08/2019 | 6.1 |
| 21/08/2019 | 6 |
| 21/08/2019 | 2.7 |
| 21/08/2019 | 0.9 |
| 21/08/2019 | 1.6 |
| 21/08/2019 | 1.5 |
| 21/08/2019 | 4.2 |
| 21/08/2019 | 1.4 |
| 21/08/2019 | 1.2 |
| 21/08/2019 | 2.2 |
| 21/08/2019 | 1.2 |
| 21/08/2019 | 0.8 |
| 21/08/2019 | 0.7 |
| 21/08/2019 | 0.3 |
| 21/08/2019 | 0.3 |
| 21/08/2019 | 0.3 |
| 22/08/2019 | 0.1 |
| 22/08/2019 | 0.1 |
| 22/08/2019 | 0.1 |
| 22/08/2019 | 0.2 |
| 22/08/2019 | 0.1 |
| 22/08/2019 | 0.6 |
| 22/08/2019 | 2.8 |
| 22/08/2019 | 5.6 |
| 22/08/2019 | 4.2 |
| 22/08/2019 | 4 |
| 22/08/2019 | 3.6 |
| 22/08/2019 | 2.2 |
| 22/08/2019 | 2.7 |
| 22/08/2019 | 2.2 |
| 22/08/2019 | 1.2 |
| 22/08/2019 | 1.8 |
| 22/08/2019 | 1.1 |
| 22/08/2019 | 1 |
| 22/08/2019 | 1.1 |
| 22/08/2019 | 1 |
| 22/08/2019 | 1.6 |
| 22/08/2019 | 0.4 |
| 22/08/2019 | 0.5 |
| 22/08/2019 | 0.3 |
| 23/08/2019 | 0.1 |
| 23/08/2019 | 0.1 |
| 23/08/2019 | 0.1 |
| 23/08/2019 | 0.2 |
| 23/08/2019 | 0.2 |
| 23/08/2019 | 0.6 |
| 23/08/2019 | 3.5 |
| 23/08/2019 | 2.7 |
| 23/08/2019 | 3.5 |
| 23/08/2019 | 2.8 |
| 23/08/2019 | 2.8 |
| 23/08/2019 | 2.1 |
| 23/08/2019 | 3.5 |
| 23/08/2019 | 1.4 |
| 23/08/2019 | 3.1 |
| 23/08/2019 | 3.1 |
| 23/08/2019 | 7.8 |
| 23/08/2019 | 0.8 |
| 23/08/2019 | 0.6 |
| 23/08/2019 | 1.1 |
| 23/08/2019 | 0.3 |
| 23/08/2019 | 1.4 |
| 23/08/2019 | 0.6 |
| 23/08/2019 | 0.4 |
| 24/08/2019 | 0.1 |
| 24/08/2019 | 0.1 |
| 24/08/2019 | 1 |
| 24/08/2019 | 0.2 |
| 24/08/2019 | 0.2 |
| 24/08/2019 | 0.4 |
| 24/08/2019 | 1.1 |
| 24/08/2019 | 0.7 |
| 24/08/2019 | 2.5 |
| 24/08/2019 | 2.1 |
| 24/08/2019 | 0.8 |
| 24/08/2019 | 1.1 |
| 24/08/2019 | 0.8 |
| 24/08/2019 | 2 |
| 24/08/2019 | 0.5 |
| 24/08/2019 | 0.6 |
| 24/08/2019 | 0.8 |
| 24/08/2019 | 0.7 |
| 24/08/2019 | 0.3 |
| 24/08/2019 | 0.3 |
| 24/08/2019 | 0.8 |
| 24/08/2019 | 0.1 |
| 24/08/2019 | 0.8 |
| 24/08/2019 | 0.4 |
| 25/08/2019 | 0.3 |
| 25/08/2019 | 0.1 |
| 25/08/2019 | 0.7 |
| 25/08/2019 | 0.1 |
| 25/08/2019 | 0.2 |
| 25/08/2019 | 0.6 |
| 25/08/2019 | 0.7 |
| 25/08/2019 | 0.9 |
| 25/08/2019 | 1.3 |
| 25/08/2019 | 2.8 |
| 25/08/2019 | 2 |
| 25/08/2019 | 2.2 |
| 25/08/2019 | 0.3 |
| 25/08/2019 | 0.4 |
| 25/08/2019 | 0.3 |
| 25/08/2019 | 0.2 |
| 25/08/2019 | 0.2 |
| 25/08/2019 | 0.1 |
| 25/08/2019 | 0.2 |
| 25/08/2019 | 0.1 |
| 25/08/2019 | 0.1 |
| 25/08/2019 | 0.1 |
| 25/08/2019 | 0.2 |
| 25/08/2019 | 0.2 |
| 26/08/2019 | 0.2 |
| 26/08/2019 | 0.2 |
| 26/08/2019 | 0.2 |
| 26/08/2019 | 0.2 |
| 26/08/2019 | 0.3 |
| 26/08/2019 | 0.3 |
| 26/08/2019 | 0.7 |
| 26/08/2019 | 1 |
| 26/08/2019 | 0.7 |
| 26/08/2019 | 0.5 |
| 26/08/2019 | 0.4 |
| 26/08/2019 | 0.8 |
| 26/08/2019 | 0.3 |
| 26/08/2019 | 0.2 |
| 26/08/2019 | 0.3 |
| 26/08/2019 | 0.3 |
| 26/08/2019 | 0.4 |
| 26/08/2019 | 0.4 |
| 26/08/2019 | 0.2 |
| 26/08/2019 | 0.1 |
| 26/08/2019 | 0.2 |
| 26/08/2019 | 0.2 |
| 26/08/2019 | 0.1 |
| 26/08/2019 | 0.1 |
| 27/08/2019 | 0.1 |
| 27/08/2019 | 0.1 |
| 27/08/2019 | 0.1 |
| 27/08/2019 | 0.1 |
| 27/08/2019 | 0.2 |
| 27/08/2019 | 0.2 |
| 27/08/2019 | 0.3 |
| 27/08/2019 | 0.3 |
| 27/08/2019 | 0.4 |
| 27/08/2019 | 0.5 |
| 27/08/2019 | 0.5 |
| 27/08/2019 | 0.5 |
| 27/08/2019 | 0.5 |
| 27/08/2019 | 0.3 |
| 27/08/2019 | 0.5 |
| 27/08/2019 | 0.5 |
| 27/08/2019 | 0.5 |
| 27/08/2019 | 0.5 |
| 27/08/2019 | 0.4 |
| 27/08/2019 | 0.2 |
| 27/08/2019 | 0.3 |
| 27/08/2019 | 0.6 |
| 27/08/2019 | 0.4 |
| 27/08/2019 | 0.3 |
| 28/08/2019 | 0.3 |
| 28/08/2019 | 0.3 |
| 28/08/2019 | 0.3 |
| 28/08/2019 | 0.3 |
| 28/08/2019 | 1 |
| 28/08/2019 | 0.9 |
| 28/08/2019 | 3.7 |
| 28/08/2019 | 3.9 |
| 28/08/2019 | 2.2 |
| 28/08/2019 | 2.1 |
| 28/08/2019 | 1.4 |
| 28/08/2019 | 0.8 |
| 28/08/2019 | 1 |
| 28/08/2019 | 0.8 |
| 28/08/2019 | 0.8 |
| 28/08/2019 | 1.3 |
| 28/08/2019 | 0.7 |
| 28/08/2019 | 1.1 |
| 28/08/2019 | 0.3 |
| 28/08/2019 | 0.2 |
| 28/08/2019 | 0.3 |
| 28/08/2019 | 0.1 |
| 28/08/2019 | 0.2 |
| 28/08/2019 | 0.1 |
| 29/08/2019 | 0.1 |
| 29/08/2019 | 0.1 |
| 29/08/2019 | 0.1 |
| 29/08/2019 | 0.2 |
| 29/08/2019 | 0.2 |
| 29/08/2019 | 0.2 |
| 29/08/2019 | 1 |
| 29/08/2019 | 0.8 |
| 29/08/2019 | 0.6 |
| 29/08/2019 | 0.5 |
| 29/08/2019 | 0.5 |
| 29/08/2019 | 0.9 |
| 29/08/2019 | 0.5 |
| 29/08/2019 | 0.8 |
| 29/08/2019 | 0.5 |
| 29/08/2019 | 0.3 |
| 29/08/2019 | 0.6 |
| 29/08/2019 | 0.5 |
| 29/08/2019 | 0.3 |
| 29/08/2019 | 0.2 |
| 29/08/2019 | 0.5 |
| 29/08/2019 | 0.4 |
| 29/08/2019 | 0.3 |
| 29/08/2019 | 0.4 |
| 30/08/2019 | 0.5 |
| 30/08/2019 | 0.7 |
| 30/08/2019 | 0.5 |
| 30/08/2019 | 0.6 |
| 30/08/2019 | 1.2 |
| 30/08/2019 | 4.4 |
| 30/08/2019 | 11.6 |
| 30/08/2019 | 26.3 |
| 30/08/2019 | 17 |
| 30/08/2019 | 9 |
| 30/08/2019 | 2.8 |
| 30/08/2019 | 6.1 |
| 30/08/2019 | 3.6 |
| 30/08/2019 | 1.3 |
| 30/08/2019 | 1.5 |
| 30/08/2019 | 3.3 |
| 30/08/2019 | 2.1 |
| 30/08/2019 | 1.5 |
| 30/08/2019 | 1.1 |
| 30/08/2019 | 1.3 |
| 30/08/2019 | 1.2 |
| 30/08/2019 | 1.4 |
| 30/08/2019 | 0.8 |
| 30/08/2019 | 1.1 |
| 31/08/2019 | 0.2 |
| 31/08/2019 | 0.6 |
| 31/08/2019 | 0.4 |
| 31/08/2019 | 0.7 |
| 31/08/2019 | 0.7 |
| 31/08/2019 | 2 |
| 31/08/2019 | 2.2 |
| 31/08/2019 | 3.5 |
| 31/08/2019 | 3.2 |
| 31/08/2019 | 2.4 |
| 31/08/2019 | 1.4 |
| 31/08/2019 | 1.2 |
| 31/08/2019 | 0.7 |
| 31/08/2019 | 0.4 |
| 31/08/2019 | 0.6 |
| 31/08/2019 | 0.7 |
| 31/08/2019 | 1.9 |
| 31/08/2019 | 1.3 |
| 31/08/2019 | 0.8 |
| 31/08/2019 | 0.4 |
| 31/08/2019 | 0.3 |
| 31/08/2019 | 0.2 |
| 31/08/2019 | 0.3 |
| 31/08/2019 | 0.4 |